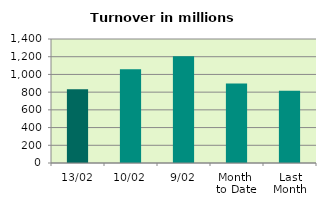
| Category | Series 0 |
|---|---|
| 13/02 | 833.408 |
| 10/02 | 1057.962 |
| 9/02 | 1205.261 |
| Month 
to Date | 898.542 |
| Last
Month | 814.821 |